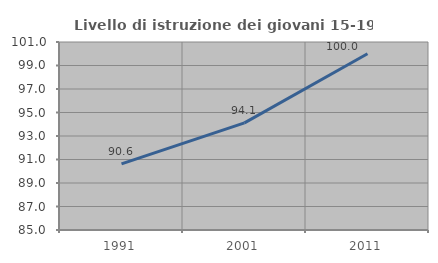
| Category | Livello di istruzione dei giovani 15-19 anni |
|---|---|
| 1991.0 | 90.625 |
| 2001.0 | 94.118 |
| 2011.0 | 100 |